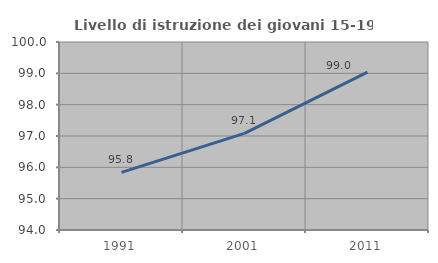
| Category | Livello di istruzione dei giovani 15-19 anni |
|---|---|
| 1991.0 | 95.84 |
| 2001.0 | 97.083 |
| 2011.0 | 99.038 |